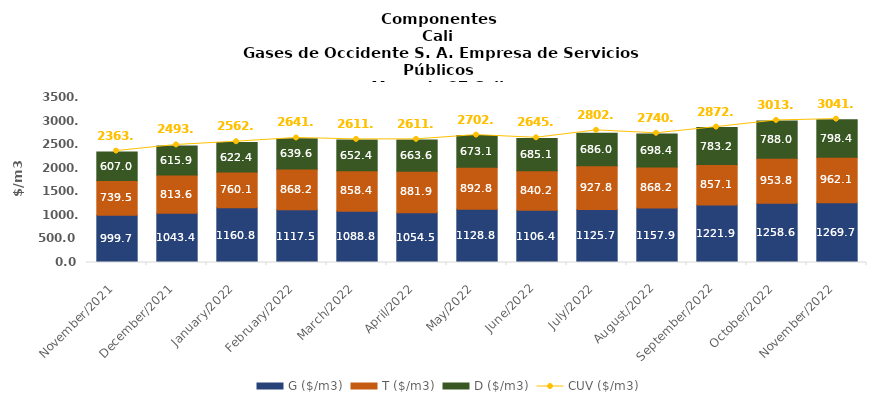
| Category | G ($/m3) | T ($/m3) | D ($/m3) |
|---|---|---|---|
| 2021-11-01 | 999.67 | 739.54 | 607.02 |
| 2021-12-01 | 1043.37 | 813.62 | 615.9 |
| 2022-01-01 | 1160.8 | 760.12 | 622.38 |
| 2022-02-01 | 1117.53 | 868.17 | 639.61 |
| 2022-03-01 | 1088.76 | 858.37 | 652.41 |
| 2022-04-01 | 1054.54 | 881.94 | 663.62 |
| 2022-05-01 | 1128.76 | 892.81 | 673.08 |
| 2022-06-01 | 1106.43 | 840.15 | 685.1 |
| 2022-07-01 | 1125.65 | 927.75 | 685.99 |
| 2022-08-01 | 1157.9 | 868.22 | 698.36 |
| 2022-09-01 | 1221.85 | 857.06 | 783.19 |
| 2022-10-01 | 1258.64 | 953.77 | 787.98 |
| 2022-11-01 | 1269.65 | 962.1 | 798.39 |